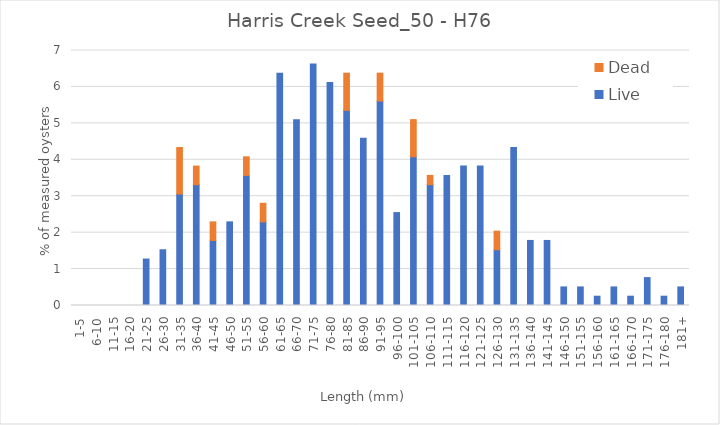
| Category | Live | Dead |
|---|---|---|
| 1-5 | 0 | 0 |
| 6-10 | 0 | 0 |
| 11-15 | 0 | 0 |
| 16-20 | 0 | 0 |
| 21-25 | 1.276 | 0 |
| 26-30 | 1.531 | 0 |
| 31-35 | 3.061 | 1.276 |
| 36-40 | 3.316 | 0.51 |
| 41-45 | 1.786 | 0.51 |
| 46-50 | 2.296 | 0 |
| 51-55 | 3.571 | 0.51 |
| 56-60 | 2.296 | 0.51 |
| 61-65 | 6.378 | 0 |
| 66-70 | 5.102 | 0 |
| 71-75 | 6.633 | 0 |
| 76-80 | 6.122 | 0 |
| 81-85 | 5.357 | 1.02 |
| 86-90 | 4.592 | 0 |
| 91-95 | 5.612 | 0.765 |
| 96-100 | 2.551 | 0 |
| 101-105 | 4.082 | 1.02 |
| 106-110 | 3.316 | 0.255 |
| 111-115 | 3.571 | 0 |
| 116-120 | 3.827 | 0 |
| 121-125 | 3.827 | 0 |
| 126-130 | 1.531 | 0.51 |
| 131-135 | 4.337 | 0 |
| 136-140 | 1.786 | 0 |
| 141-145 | 1.786 | 0 |
| 146-150 | 0.51 | 0 |
| 151-155 | 0.51 | 0 |
| 156-160 | 0.255 | 0 |
| 161-165 | 0.51 | 0 |
| 166-170 | 0.255 | 0 |
| 171-175 | 0.765 | 0 |
| 176-180 | 0.255 | 0 |
| 181+ | 0.51 | 0 |